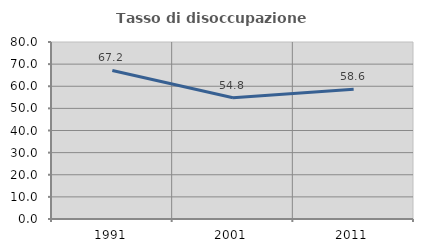
| Category | Tasso di disoccupazione giovanile  |
|---|---|
| 1991.0 | 67.153 |
| 2001.0 | 54.795 |
| 2011.0 | 58.621 |